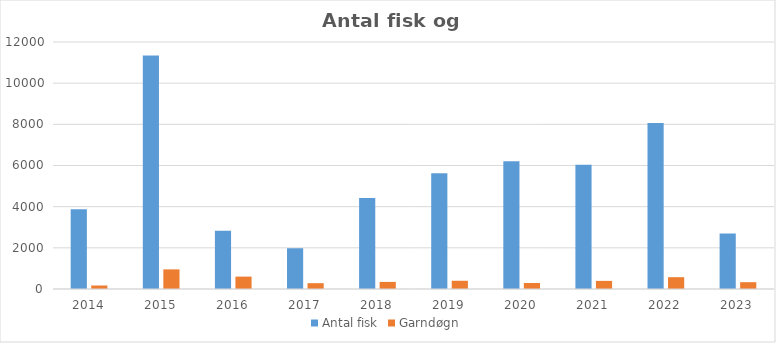
| Category | Antal fisk | Garndøgn |
|---|---|---|
| 2014.0 | 3872 | 170 |
| 2015.0 | 11344 | 953 |
| 2016.0 | 2826 | 602 |
| 2017.0 | 1980 | 283 |
| 2018.0 | 4422 | 344 |
| 2019.0 | 5618 | 400 |
| 2020.0 | 6202 | 291 |
| 2021.0 | 6042 | 394 |
| 2022.0 | 8066 | 573 |
| 2023.0 | 2691 | 331 |